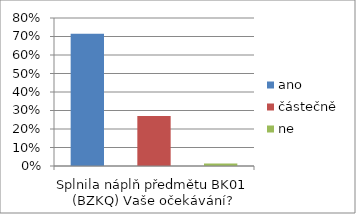
| Category | ano | částečně | ne |
|---|---|---|---|
| Splnila náplň předmětu BK01 (BZKQ) Vaše očekávání? | 0.715 | 0.271 | 0.014 |